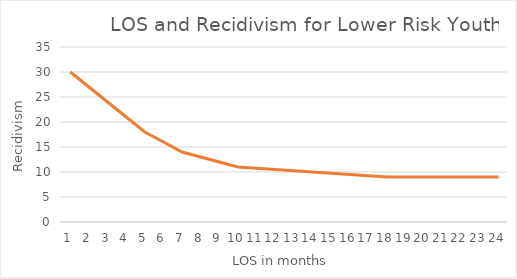
| Category | Series 1 |
|---|---|
| 0 | 30 |
| 1 | 27 |
| 2 | 24 |
| 3 | 21 |
| 4 | 18 |
| 5 | 16 |
| 6 | 14 |
| 7 | 13 |
| 8 | 12 |
| 9 | 11 |
| 10 | 10.75 |
| 11 | 10.5 |
| 12 | 10.25 |
| 13 | 10 |
| 14 | 9.75 |
| 15 | 9.5 |
| 16 | 9.25 |
| 17 | 9 |
| 18 | 9 |
| 19 | 9 |
| 20 | 9 |
| 21 | 9 |
| 22 | 9 |
| 23 | 9 |